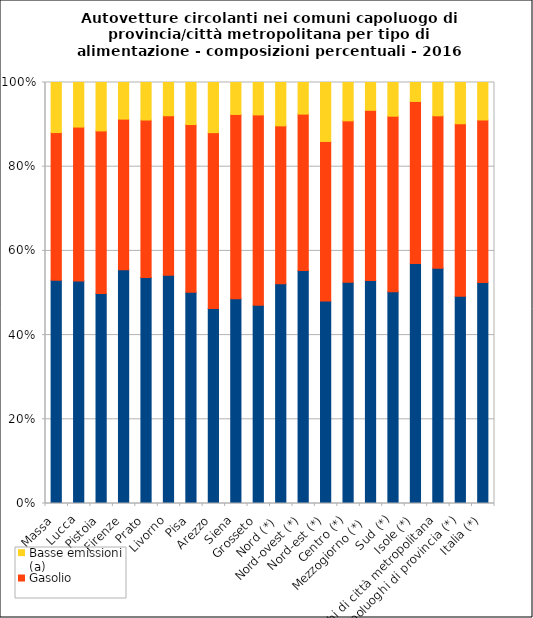
| Category | Benzina | Gasolio | Basse emissioni (a) |
|---|---|---|---|
| Massa | 53.1 | 35.1 | 11.9 |
| Lucca | 52.9 | 36.6 | 10.6 |
| Pistoia | 49.9 | 38.6 | 11.5 |
| Firenze | 55.5 | 35.8 | 8.7 |
| Prato | 53.6 | 37.4 | 8.9 |
| Livorno | 54.2 | 37.9 | 7.9 |
| Pisa | 50.2 | 39.9 | 10 |
| Arezzo | 46.3 | 41.7 | 11.9 |
| Siena | 48.7 | 43.8 | 7.6 |
| Grosseto | 47.1 | 45.2 | 7.7 |
| Nord (*)  | 52.2 | 37.5 | 10.3 |
| Nord-ovest (*) | 55.3 | 37.1 | 7.5 |
| Nord-est (*) | 48.1 | 37.9 | 14 |
| Centro (*) | 52.5 | 38.3 | 9.1 |
| Mezzogiorno (*)  | 52.9 | 40.4 | 6.6 |
| Sud (*) | 50.3 | 41.7 | 8 |
| Isole (*) | 57 | 38.5 | 4.5 |
| Capoluoghi di città metropolitana | 55.8 | 36.2 | 7.9 |
| Capoluoghi di provincia (*) | 49.2 | 41 | 9.8 |
| Italia (*) | 52.5 | 38.6 | 8.9 |